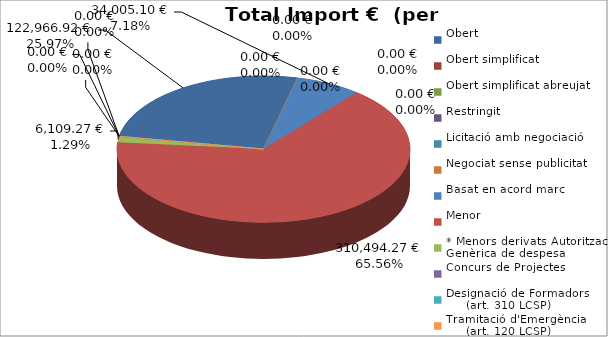
| Category | Total preu
(amb IVA) |
|---|---|
| Obert | 122966.92 |
| Obert simplificat | 0 |
| Obert simplificat abreujat | 0 |
| Restringit | 0 |
| Licitació amb negociació | 0 |
| Negociat sense publicitat | 0 |
| Basat en acord marc | 34005.1 |
| Menor | 310494.27 |
| * Menors derivats Autorització Genèrica de despesa | 6109.27 |
| Concurs de Projectes | 0 |
| Designació de Formadors
     (art. 310 LCSP) | 0 |
| Tramitació d'Emergència
     (art. 120 LCSP) | 0 |